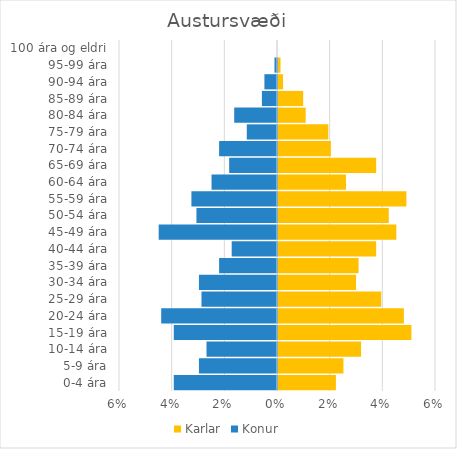
| Category | Karlar | Konur |
|---|---|---|
| 0-4 ára | 0.022 | -0.039 |
| 5-9 ára | 0.025 | -0.03 |
| 10-14 ára | 0.032 | -0.027 |
| 15-19 ára | 0.051 | -0.039 |
| 20-24 ára | 0.048 | -0.044 |
| 25-29 ára | 0.039 | -0.029 |
| 30-34 ára | 0.03 | -0.03 |
| 35-39 ára | 0.031 | -0.022 |
| 40-44 ára | 0.037 | -0.017 |
| 45-49 ára | 0.045 | -0.045 |
| 50-54 ára | 0.042 | -0.031 |
| 55-59 ára | 0.049 | -0.033 |
| 60-64 ára | 0.026 | -0.025 |
| 65-69 ára | 0.037 | -0.018 |
| 70-74 ára | 0.02 | -0.022 |
| 75-79 ára | 0.019 | -0.011 |
| 80-84 ára | 0.011 | -0.016 |
| 85-89 ára | 0.01 | -0.006 |
| 90-94 ára | 0.002 | -0.005 |
| 95-99 ára | 0.001 | -0.001 |
| 100 ára og eldri | 0 | 0 |